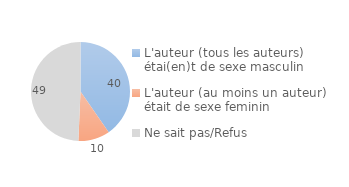
| Category | Series 0 |
|---|---|
| L'auteur (tous les auteurs) étai(en)t de sexe masculin | 40.362 |
| L'auteur (au moins un auteur) était de sexe feminin | 10.323 |
| Ne sait pas/Refus | 49.315 |